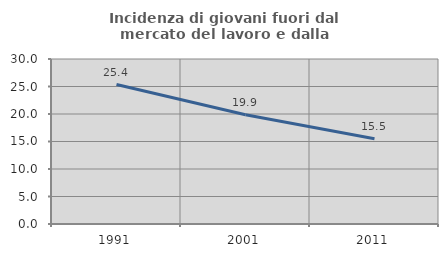
| Category | Incidenza di giovani fuori dal mercato del lavoro e dalla formazione  |
|---|---|
| 1991.0 | 25.363 |
| 2001.0 | 19.864 |
| 2011.0 | 15.498 |